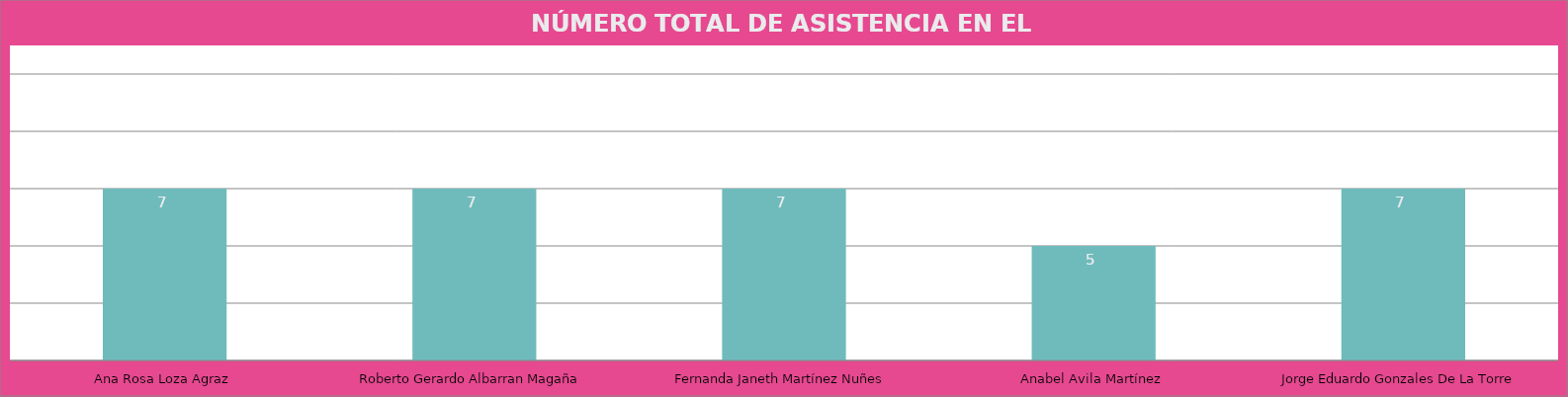
| Category | Ana Rosa Loza Agraz |
|---|---|
| Ana Rosa Loza Agraz | 7 |
| Roberto Gerardo Albarran Magaña | 7 |
| Fernanda Janeth Martínez Nuñes | 7 |
| Anabel Avila Martínez | 5 |
| Jorge Eduardo Gonzales De La Torre | 7 |